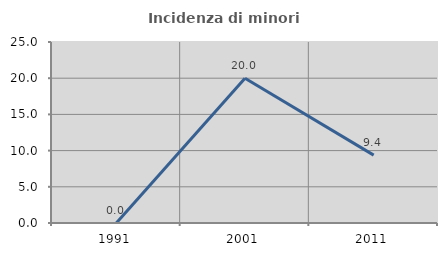
| Category | Incidenza di minori stranieri |
|---|---|
| 1991.0 | 0 |
| 2001.0 | 20 |
| 2011.0 | 9.375 |